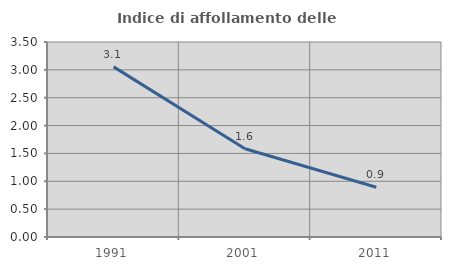
| Category | Indice di affollamento delle abitazioni  |
|---|---|
| 1991.0 | 3.054 |
| 2001.0 | 1.583 |
| 2011.0 | 0.893 |